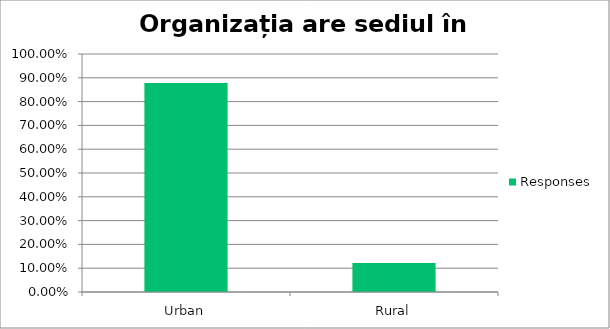
| Category | Responses |
|---|---|
| Urban | 0.878 |
| Rural | 0.122 |